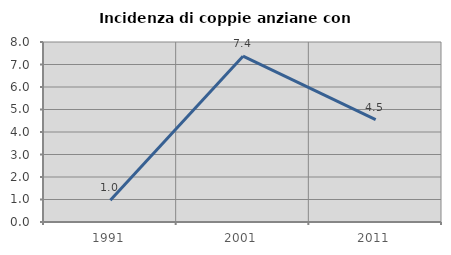
| Category | Incidenza di coppie anziane con figli |
|---|---|
| 1991.0 | 0.971 |
| 2001.0 | 7.368 |
| 2011.0 | 4.545 |